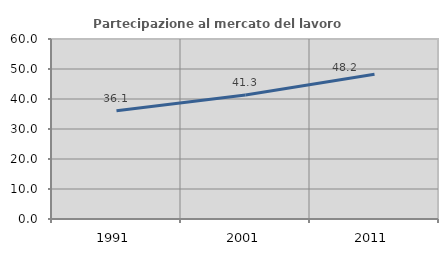
| Category | Partecipazione al mercato del lavoro  femminile |
|---|---|
| 1991.0 | 36.084 |
| 2001.0 | 41.334 |
| 2011.0 | 48.237 |